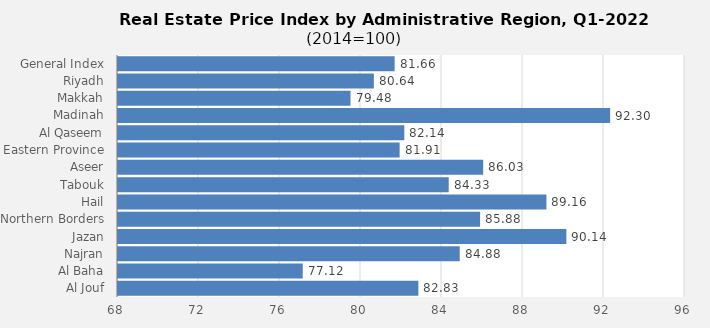
| Category | 2022 |
|---|---|
| General Index | 81.662 |
| Riyadh | 80.635 |
| Makkah | 79.482 |
| Madinah | 92.302 |
| Al Qaseem | 82.139 |
| Eastern Province | 81.908 |
| Aseer | 86.034 |
| Tabouk | 84.332 |
| Hail | 89.157 |
| Northern Borders | 85.881 |
| Jazan | 90.143 |
| Najran | 84.875 |
| Al Baha | 77.124 |
| Al Jouf | 82.833 |